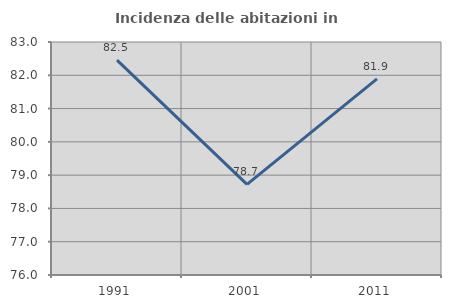
| Category | Incidenza delle abitazioni in proprietà  |
|---|---|
| 1991.0 | 82.456 |
| 2001.0 | 78.723 |
| 2011.0 | 81.89 |